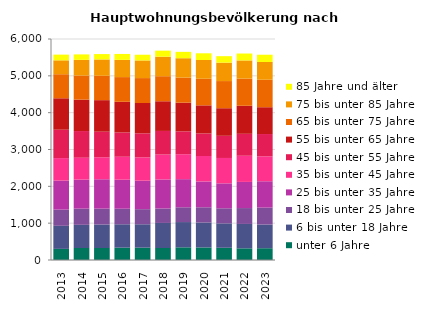
| Category | unter 6 Jahre | 6 bis unter 18 Jahre | 18 bis unter 25 Jahre | 25 bis unter 35 Jahre | 35 bis unter 45 Jahre | 45 bis unter 55 Jahre | 55 bis unter 65 Jahre | 65 bis unter 75 Jahre | 75 bis unter 85 Jahre | 85 Jahre und älter |
|---|---|---|---|---|---|---|---|---|---|---|
| 2013.0 | 302 | 626 | 440 | 788 | 611 | 770 | 854 | 653 | 377 | 155 |
| 2014.0 | 326 | 629 | 440 | 788 | 593 | 725 | 854 | 653 | 425 | 149 |
| 2015.0 | 326 | 638 | 431 | 797 | 596 | 695 | 857 | 662 | 443 | 146 |
| 2016.0 | 335 | 635 | 422 | 788 | 623 | 659 | 833 | 671 | 467 | 161 |
| 2017.0 | 335 | 635 | 410 | 773 | 632 | 653 | 824 | 677 | 479 | 155 |
| 2018.0 | 326 | 680 | 392 | 788 | 677 | 641 | 806 | 680 | 530 | 164 |
| 2019.0 | 344 | 686 | 401 | 764 | 677 | 620 | 779 | 680 | 527 | 173 |
| 2020.0 | 341 | 677 | 413 | 701 | 692 | 611 | 764 | 722 | 509 | 182 |
| 2021.0 | 332 | 662 | 410 | 677 | 689 | 602 | 749 | 737 | 500 | 176 |
| 2022.0 | 317 | 662 | 431 | 710 | 710 | 596 | 761 | 737 | 494 | 188 |
| 2023.0 | 320 | 644 | 458 | 716 | 677 | 605 | 728 | 746 | 482 | 197 |